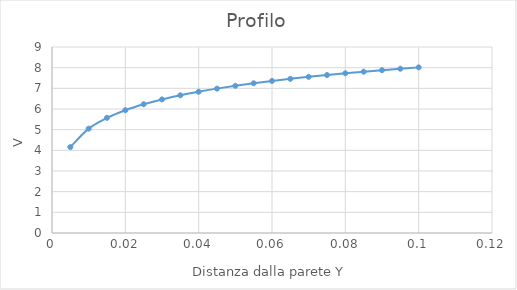
| Category | Series 0 |
|---|---|
| 0.005 | 4.157 |
| 0.01 | 5.049 |
| 0.015 | 5.571 |
| 0.02 | 5.942 |
| 0.025 | 6.229 |
| 0.030000000000000002 | 6.464 |
| 0.035 | 6.662 |
| 0.04 | 6.834 |
| 0.045 | 6.986 |
| 0.049999999999999996 | 7.122 |
| 0.05499999999999999 | 7.244 |
| 0.05999999999999999 | 7.356 |
| 0.06499999999999999 | 7.46 |
| 0.06999999999999999 | 7.555 |
| 0.075 | 7.644 |
| 0.08 | 7.727 |
| 0.085 | 7.805 |
| 0.09000000000000001 | 7.879 |
| 0.09500000000000001 | 7.948 |
| 0.10000000000000002 | 8.014 |